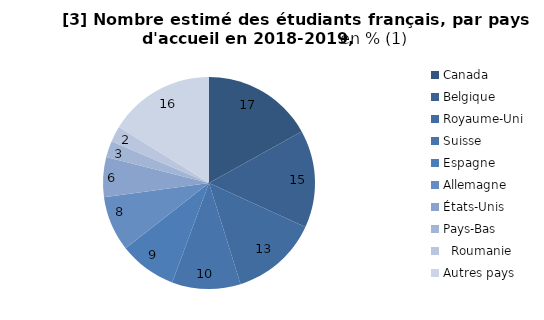
| Category | Series 0 |
|---|---|
| Canada | 16.92 |
| Belgique | 14.91 |
| Royaume-Uni | 13.35 |
| Suisse | 10.47 |
| Espagne | 8.773 |
| Allemagne | 8.42 |
| États-Unis | 6.094 |
| Pays-Bas | 2.519 |
|   Roumanie | 2.386 |
| Autres pays | 16.157 |